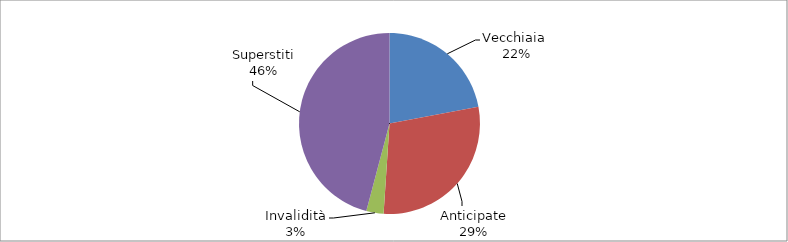
| Category | Series 0 |
|---|---|
| Vecchiaia  | 3857 |
| Anticipate | 5075 |
| Invalidità | 540 |
| Superstiti | 8028 |